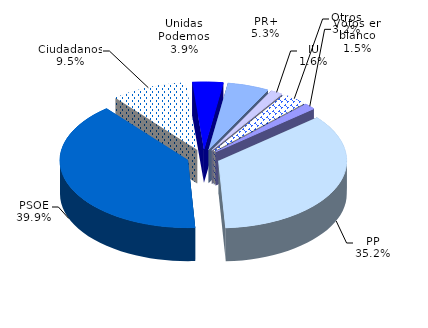
| Category | 2015 |
|---|---|
| PP | 55988 |
| PSOE | 63412 |
| Ciudadanos | 15125 |
| Unidas Podemos | 6147 |
| PR+ | 8357 |
| IU | 2465 |
| Otros | 5064 |
| Votos en blanco | 2374 |